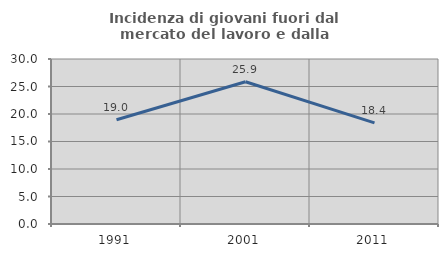
| Category | Incidenza di giovani fuori dal mercato del lavoro e dalla formazione  |
|---|---|
| 1991.0 | 18.964 |
| 2001.0 | 25.854 |
| 2011.0 | 18.386 |